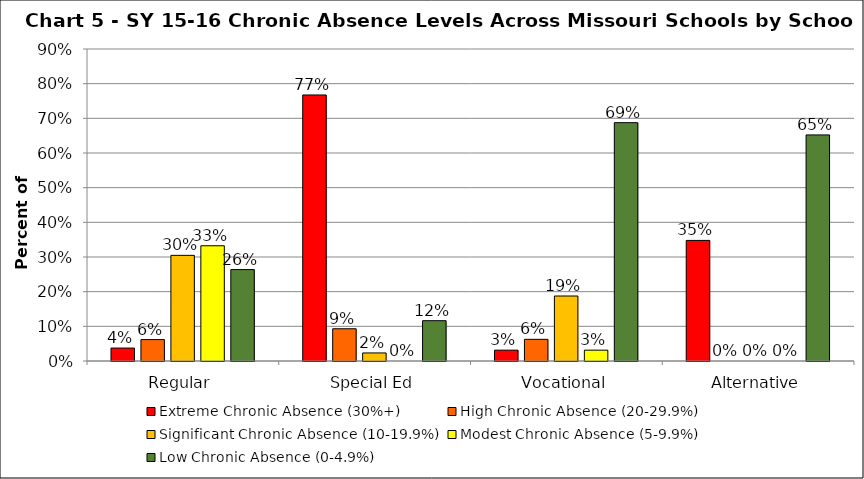
| Category | Extreme Chronic Absence (30%+) | High Chronic Absence (20-29.9%) | Significant Chronic Absence (10-19.9%) | Modest Chronic Absence (5-9.9%) | Low Chronic Absence (0-4.9%) |
|---|---|---|---|---|---|
| 0 | 0.037 | 0.062 | 0.305 | 0.332 | 0.264 |
| 1 | 0.767 | 0.093 | 0.023 | 0 | 0.116 |
| 2 | 0.031 | 0.062 | 0.188 | 0.031 | 0.688 |
| 3 | 0.348 | 0 | 0 | 0 | 0.652 |